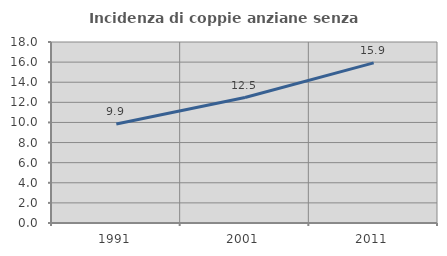
| Category | Incidenza di coppie anziane senza figli  |
|---|---|
| 1991.0 | 9.854 |
| 2001.0 | 12.474 |
| 2011.0 | 15.926 |